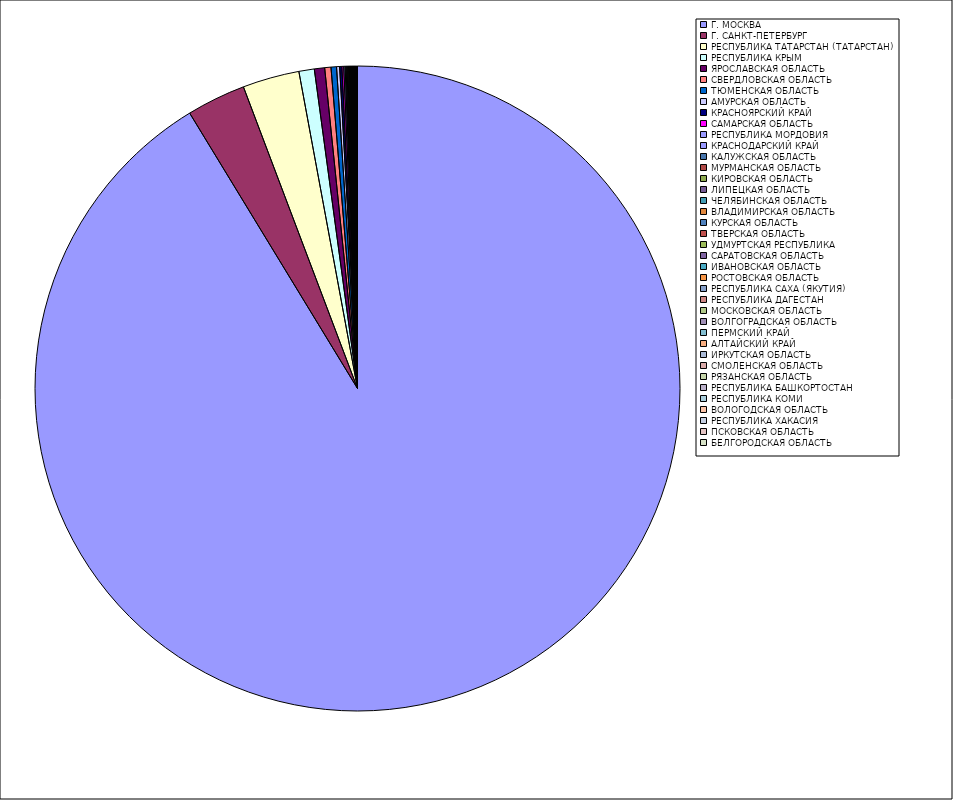
| Category | Оборот |
|---|---|
| Г. МОСКВА | 91.254 |
| Г. САНКТ-ПЕТЕРБУРГ | 2.955 |
| РЕСПУБЛИКА ТАТАРСТАН (ТАТАРСТАН) | 2.843 |
| РЕСПУБЛИКА КРЫМ | 0.77 |
| ЯРОСЛАВСКАЯ ОБЛАСТЬ | 0.516 |
| СВЕРДЛОВСКАЯ ОБЛАСТЬ | 0.314 |
| ТЮМЕНСКАЯ ОБЛАСТЬ | 0.274 |
| АМУРСКАЯ ОБЛАСТЬ | 0.153 |
| КРАСНОЯРСКИЙ КРАЙ | 0.11 |
| САМАРСКАЯ ОБЛАСТЬ | 0.092 |
| РЕСПУБЛИКА МОРДОВИЯ | 0.069 |
| КРАСНОДАРСКИЙ КРАЙ | 0.047 |
| КАЛУЖСКАЯ ОБЛАСТЬ | 0.044 |
| МУРМАНСКАЯ ОБЛАСТЬ | 0.04 |
| КИРОВСКАЯ ОБЛАСТЬ | 0.04 |
| ЛИПЕЦКАЯ ОБЛАСТЬ | 0.038 |
| ЧЕЛЯБИНСКАЯ ОБЛАСТЬ | 0.033 |
| ВЛАДИМИРСКАЯ ОБЛАСТЬ | 0.028 |
| КУРСКАЯ ОБЛАСТЬ | 0.027 |
| ТВЕРСКАЯ ОБЛАСТЬ | 0.026 |
| УДМУРТСКАЯ РЕСПУБЛИКА | 0.025 |
| САРАТОВСКАЯ ОБЛАСТЬ | 0.025 |
| ИВАНОВСКАЯ ОБЛАСТЬ | 0.025 |
| РОСТОВСКАЯ ОБЛАСТЬ | 0.021 |
| РЕСПУБЛИКА САХА (ЯКУТИЯ) | 0.021 |
| РЕСПУБЛИКА ДАГЕСТАН | 0.019 |
| МОСКОВСКАЯ ОБЛАСТЬ | 0.018 |
| ВОЛГОГРАДСКАЯ ОБЛАСТЬ | 0.018 |
| ПЕРМСКИЙ КРАЙ | 0.016 |
| АЛТАЙСКИЙ КРАЙ | 0.014 |
| ИРКУТСКАЯ ОБЛАСТЬ | 0.014 |
| СМОЛЕНСКАЯ ОБЛАСТЬ | 0.013 |
| РЯЗАНСКАЯ ОБЛАСТЬ | 0.012 |
| РЕСПУБЛИКА БАШКОРТОСТАН | 0.011 |
| РЕСПУБЛИКА КОМИ | 0.011 |
| ВОЛОГОДСКАЯ ОБЛАСТЬ | 0.007 |
| РЕСПУБЛИКА ХАКАСИЯ | 0.007 |
| ПСКОВСКАЯ ОБЛАСТЬ | 0.006 |
| БЕЛГОРОДСКАЯ ОБЛАСТЬ | 0.005 |